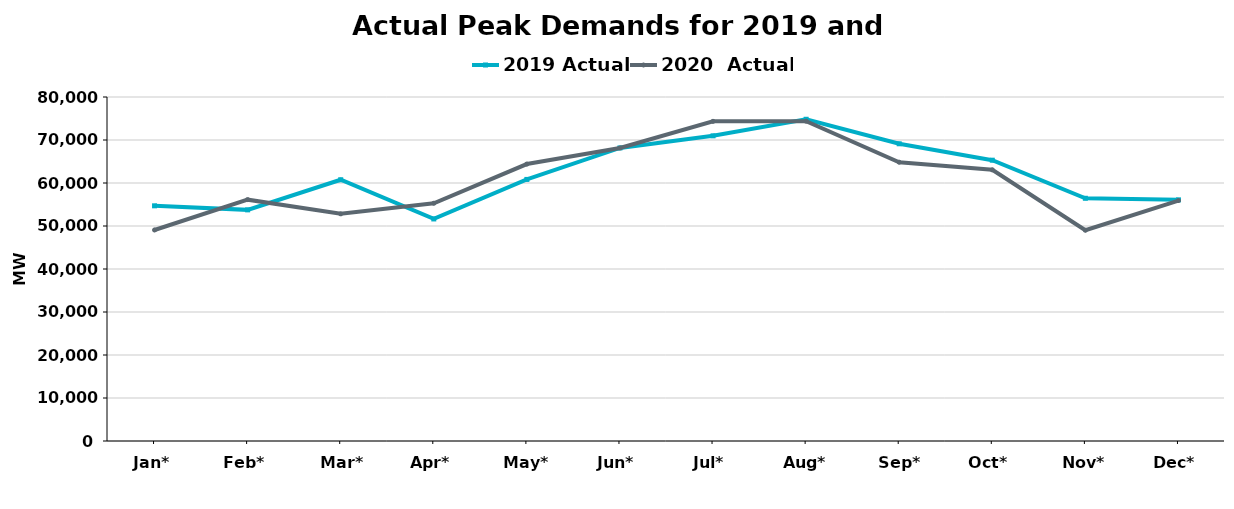
| Category | 2019 Actual | 2020  Actual |
|---|---|---|
| Jan* | 54693 | 49072 |
| Feb* | 53752 | 56128 |
| Mar* | 60756 | 52833 |
| Apr* | 51640 | 55292 |
| May* | 60832 | 64411 |
| Jun* | 68159 | 68146 |
| Jul* | 70970 | 74344 |
| Aug* | 74820 | 74376 |
| Sep* | 69122 | 64835 |
| Oct* | 65304 | 63064 |
| Nov* | 56446 | 49020 |
| Dec* | 56080 | 55916 |